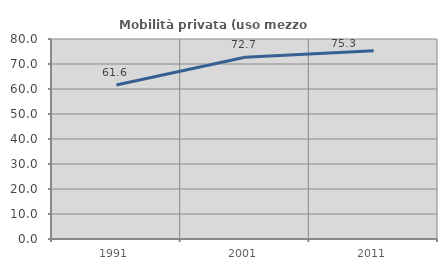
| Category | Mobilità privata (uso mezzo privato) |
|---|---|
| 1991.0 | 61.591 |
| 2001.0 | 72.722 |
| 2011.0 | 75.31 |